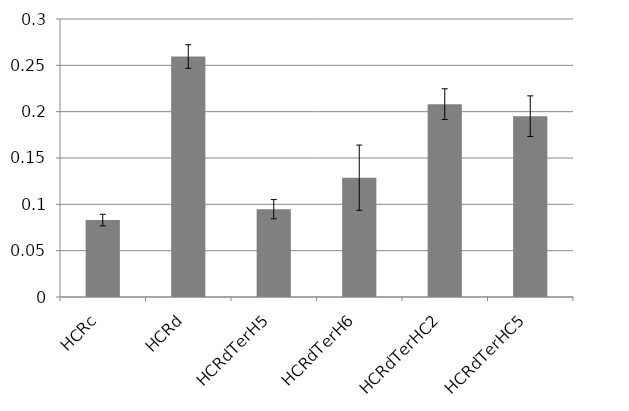
| Category | Series 0 |
|---|---|
| HCRc | 0.083 |
| HCRd | 0.26 |
| HCRdTerH5 | 0.095 |
| HCRdTerH6 | 0.129 |
| HCRdTerHC2 | 0.208 |
| HCRdTerHC5 | 0.195 |